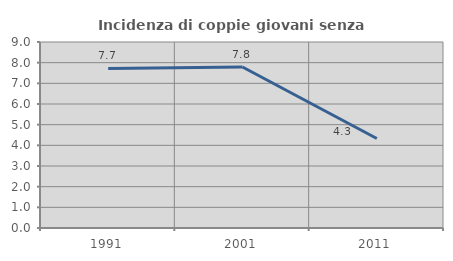
| Category | Incidenza di coppie giovani senza figli |
|---|---|
| 1991.0 | 7.723 |
| 2001.0 | 7.791 |
| 2011.0 | 4.332 |